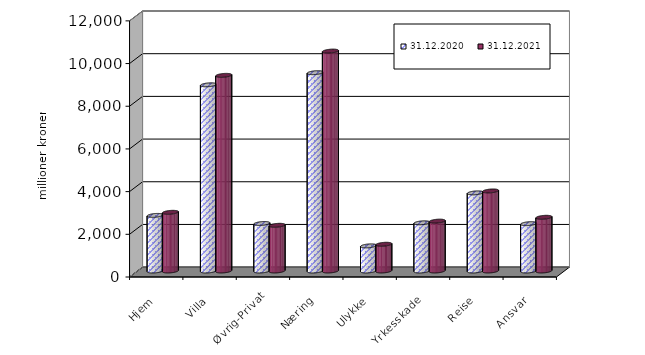
| Category | 31.12.2020 | 31.12.2021 |
|---|---|---|
| Hjem | 2604.92 | 2749.368 |
| Villa | 8723.618 | 9165.907 |
| Øvrig-Privat | 2225.908 | 2140.915 |
| Næring | 9292.045 | 10302.974 |
| Ulykke | 1177.983 | 1252.363 |
| Yrkesskade | 2258.455 | 2336.184 |
| Reise | 3660.68 | 3750.307 |
| Ansvar | 2218.303 | 2516.224 |